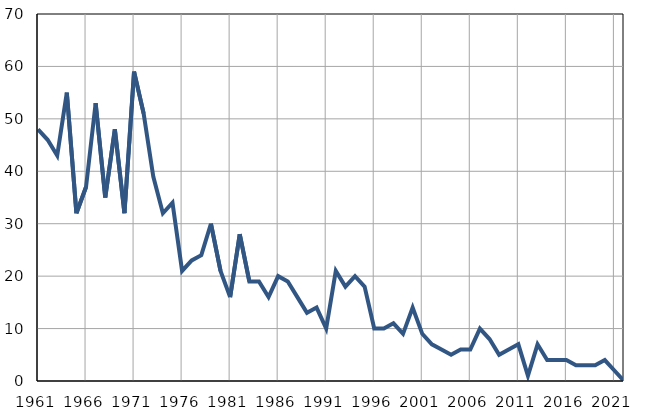
| Category | Infants
deaths |
|---|---|
| 1961.0 | 48 |
| 1962.0 | 46 |
| 1963.0 | 43 |
| 1964.0 | 55 |
| 1965.0 | 32 |
| 1966.0 | 37 |
| 1967.0 | 53 |
| 1968.0 | 35 |
| 1969.0 | 48 |
| 1970.0 | 32 |
| 1971.0 | 59 |
| 1972.0 | 51 |
| 1973.0 | 39 |
| 1974.0 | 32 |
| 1975.0 | 34 |
| 1976.0 | 21 |
| 1977.0 | 23 |
| 1978.0 | 24 |
| 1979.0 | 30 |
| 1980.0 | 21 |
| 1981.0 | 16 |
| 1982.0 | 28 |
| 1983.0 | 19 |
| 1984.0 | 19 |
| 1985.0 | 16 |
| 1986.0 | 20 |
| 1987.0 | 19 |
| 1988.0 | 16 |
| 1989.0 | 13 |
| 1990.0 | 14 |
| 1991.0 | 10 |
| 1992.0 | 21 |
| 1993.0 | 18 |
| 1994.0 | 20 |
| 1995.0 | 18 |
| 1996.0 | 10 |
| 1997.0 | 10 |
| 1998.0 | 11 |
| 1999.0 | 9 |
| 2000.0 | 14 |
| 2001.0 | 9 |
| 2002.0 | 7 |
| 2003.0 | 6 |
| 2004.0 | 5 |
| 2005.0 | 6 |
| 2006.0 | 6 |
| 2007.0 | 10 |
| 2008.0 | 8 |
| 2009.0 | 5 |
| 2010.0 | 6 |
| 2011.0 | 7 |
| 2012.0 | 1 |
| 2013.0 | 7 |
| 2014.0 | 4 |
| 2015.0 | 4 |
| 2016.0 | 4 |
| 2017.0 | 3 |
| 2018.0 | 3 |
| 2019.0 | 3 |
| 2020.0 | 4 |
| 2021.0 | 2 |
| 2022.0 | 0 |